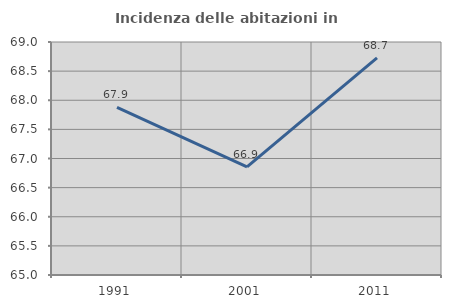
| Category | Incidenza delle abitazioni in proprietà  |
|---|---|
| 1991.0 | 67.879 |
| 2001.0 | 66.857 |
| 2011.0 | 68.727 |